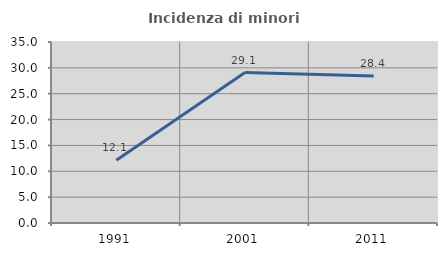
| Category | Incidenza di minori stranieri |
|---|---|
| 1991.0 | 12.121 |
| 2001.0 | 29.085 |
| 2011.0 | 28.437 |